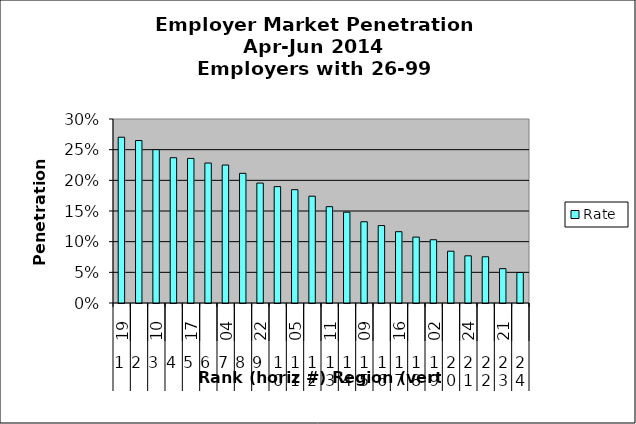
| Category | Rate |
|---|---|
| 0 | 0.27 |
| 1 | 0.265 |
| 2 | 0.25 |
| 3 | 0.237 |
| 4 | 0.236 |
| 5 | 0.228 |
| 6 | 0.225 |
| 7 | 0.211 |
| 8 | 0.196 |
| 9 | 0.19 |
| 10 | 0.185 |
| 11 | 0.174 |
| 12 | 0.157 |
| 13 | 0.148 |
| 14 | 0.132 |
| 15 | 0.126 |
| 16 | 0.116 |
| 17 | 0.107 |
| 18 | 0.103 |
| 19 | 0.084 |
| 20 | 0.077 |
| 21 | 0.075 |
| 22 | 0.056 |
| 23 | 0.05 |